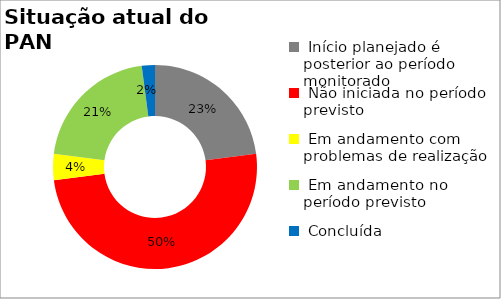
| Category | Series 0 |
|---|---|
|  Início planejado é posterior ao período monitorado | 0.229 |
|  Não iniciada no período previsto | 0.5 |
|  Em andamento com problemas de realização | 0.042 |
|  Em andamento no período previsto  | 0.208 |
|  Concluída | 0.021 |